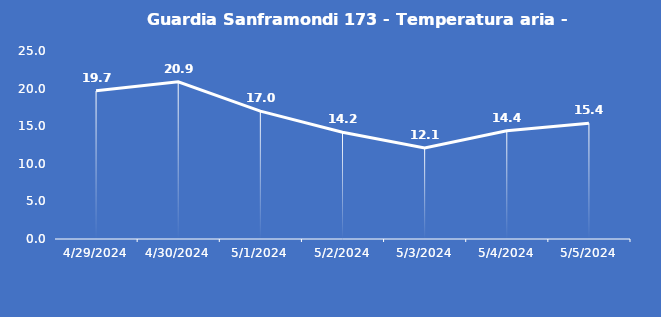
| Category | Guardia Sanframondi 173 - Temperatura aria - Grezzo (°C) |
|---|---|
| 4/29/24 | 19.7 |
| 4/30/24 | 20.9 |
| 5/1/24 | 17 |
| 5/2/24 | 14.2 |
| 5/3/24 | 12.1 |
| 5/4/24 | 14.4 |
| 5/5/24 | 15.4 |